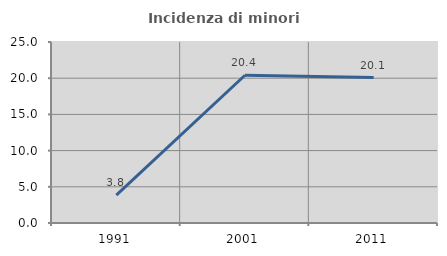
| Category | Incidenza di minori stranieri |
|---|---|
| 1991.0 | 3.846 |
| 2001.0 | 20.408 |
| 2011.0 | 20.082 |